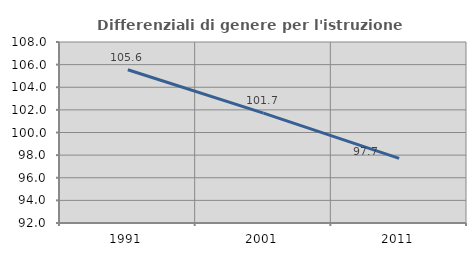
| Category | Differenziali di genere per l'istruzione superiore |
|---|---|
| 1991.0 | 105.55 |
| 2001.0 | 101.719 |
| 2011.0 | 97.713 |